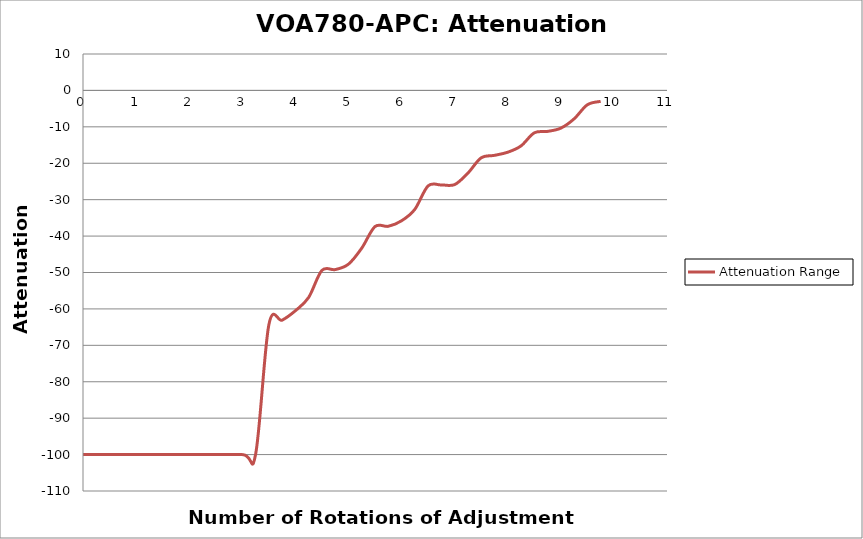
| Category | Attenuation Range |
|---|---|
| 0.0 | -100 |
| 1.0 | -100 |
| 2.0 | -100 |
| 3.0 | -100 |
| 3.25 | -100 |
| 3.5 | -64.4 |
| 3.75 | -63.1 |
| 4.0 | -60.5 |
| 4.25 | -56.85 |
| 4.5 | -49.43 |
| 4.75 | -49.2 |
| 5.0 | -47.71 |
| 5.25 | -43.32 |
| 5.5 | -37.39 |
| 5.75 | -37.31 |
| 6.0 | -35.8 |
| 6.25 | -32.66 |
| 6.5 | -26.22 |
| 6.75 | -25.96 |
| 7.0 | -25.86 |
| 7.25 | -22.71 |
| 7.5 | -18.51 |
| 7.75 | -17.83 |
| 8.0 | -16.97 |
| 8.25 | -15.24 |
| 8.5 | -11.65 |
| 8.75 | -11.25 |
| 9.0 | -10.36 |
| 9.25 | -7.81 |
| 9.5 | -3.94 |
| 9.75 | -3 |